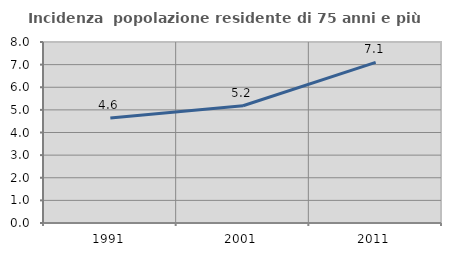
| Category | Incidenza  popolazione residente di 75 anni e più |
|---|---|
| 1991.0 | 4.642 |
| 2001.0 | 5.182 |
| 2011.0 | 7.102 |